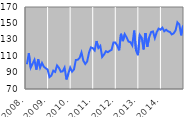
| Category | Series 0 |
|---|---|
| 2008. | 100.197 |
| 2  | 113.588 |
| 3  | 96.096 |
| 4  | 100.815 |
| 5  | 105.563 |
| 6  | 93.649 |
| 7  | 106.166 |
| 8  | 96.011 |
| 9  | 101.755 |
| 10  | 97.173 |
| 11  | 95.325 |
| 12  | 93.662 |
| 2009. | 84.558 |
| 2  | 86.427 |
| 3  | 92.351 |
| 4  | 90.807 |
| 5  | 98.702 |
| 6  | 95.849 |
| 7  | 91.051 |
| 8  | 91.606 |
| 9  | 96.048 |
| 10  | 81.666 |
| 11  | 88.644 |
| 12  | 96.146 |
| 2010. | 91.163 |
| 2  | 93.89 |
| 3  | 105.5 |
| 4  | 105.53 |
| 5  | 107.966 |
| 6  | 114.503 |
| 7  | 104.45 |
| 8  | 100.528 |
| 9  | 103.531 |
| 10  | 114.386 |
| 11  | 120.705 |
| 12  | 119.875 |
| 2011. | 117.058 |
| 2  | 128.471 |
| 3  | 119.993 |
| 4  | 122.583 |
| 5  | 109.134 |
| 6  | 112.036 |
| 7  | 116.052 |
| 8  | 114.886 |
| 9  | 116.492 |
| 10  | 117.799 |
| 11  | 126.794 |
| 12  | 126.765 |
| 2012. | 122.89 |
| 2  | 117.179 |
| 3  | 137.328 |
| 4  | 128.414 |
| 5  | 136.864 |
| 6  | 132.823 |
| 7  | 127.841 |
| 8  | 127.118 |
| 9  | 123.173 |
| 10  | 141.197 |
| 11  | 116.903 |
| 12  | 111.257 |
| 2013. | 135.85 |
| 2  | 132.585 |
| 3  | 118.231 |
| 4  | 138.277 |
| 5  | 121.542 |
| 6  | 133.034 |
| 7  | 139.391 |
| 8  | 140.15 |
| 9  | 132.154 |
| 10  | 139.33 |
| 11  | 143.644 |
| 12  | 142.331 |
| 2014. | 144.778 |
| 2  | 140.439 |
| 3  | 142.249 |
| 4  | 140.378 |
| 5  | 139.549 |
| 6  | 136.56 |
| 7  | 137.828 |
| 8  | 141.265 |
| 9  | 151.285 |
| 10  | 148.894 |
| 11  | 135.493 |
| 12  | 147.284 |